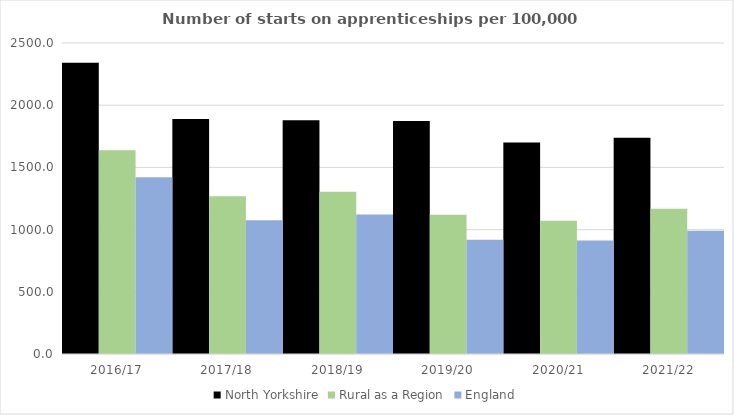
| Category | North Yorkshire | Rural as a Region | England |
|---|---|---|---|
| 2016/17 | 2341.47 | 1638.789 | 1420 |
| 2017/18 | 1888.561 | 1267.474 | 1075 |
| 2018/19 | 1878.792 | 1304.57 | 1122 |
| 2019/20 | 1872.33 | 1119.662 | 918 |
| 2020/21 | 1700.435 | 1070.748 | 912 |
| 2021/22 | 1738.963 | 1167.68 | 991 |